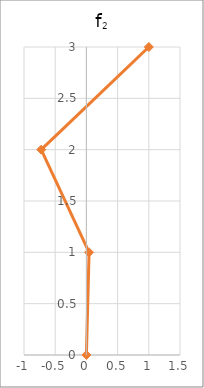
| Category | f2 |
|---|---|
| 0.0 | 0 |
| 0.04290129991992386 | 1 |
| -0.7239117691207033 | 2 |
| 1.0 | 3 |